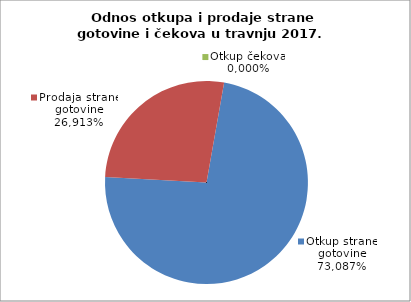
| Category | Otkup strane gotovine |
|---|---|
| 0 | 0.731 |
| 1 | 0.269 |
| 2 | 0 |